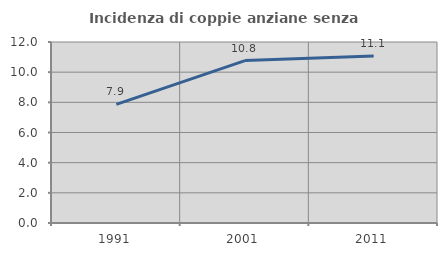
| Category | Incidenza di coppie anziane senza figli  |
|---|---|
| 1991.0 | 7.865 |
| 2001.0 | 10.769 |
| 2011.0 | 11.077 |